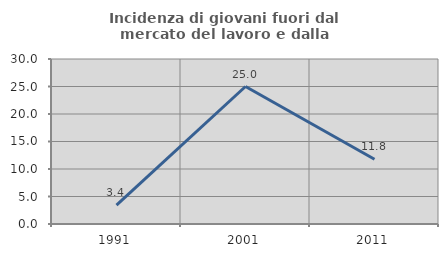
| Category | Incidenza di giovani fuori dal mercato del lavoro e dalla formazione  |
|---|---|
| 1991.0 | 3.448 |
| 2001.0 | 25 |
| 2011.0 | 11.765 |